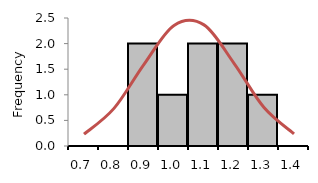
| Category | Freq |
|---|---|
| 0.7 | 0 |
| 0.8 | 0 |
| 0.9 | 2 |
| 1.0 | 1 |
| 1.1 | 2 |
| 1.2 | 2 |
| 1.3 | 1 |
| 1.4 | 0 |